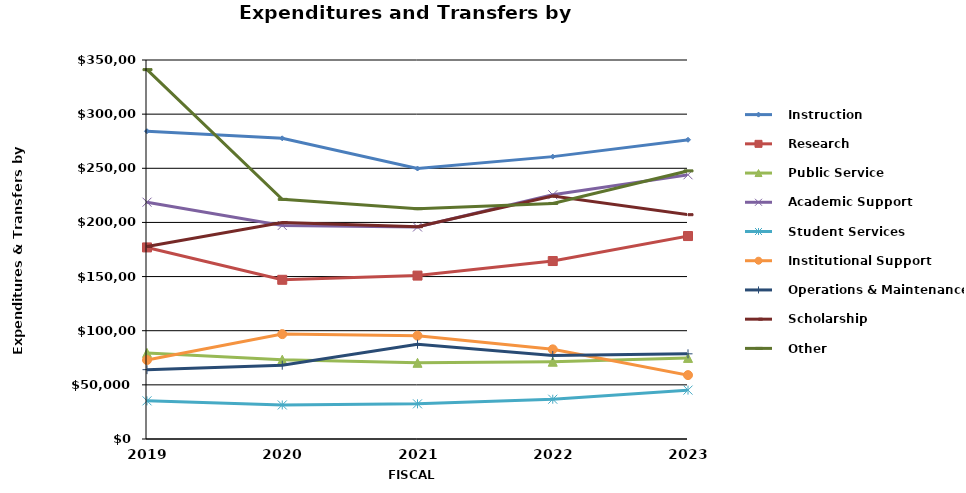
| Category |    Instruction |    Research |    Public Service |    Academic Support |    Student Services |    Institutional Support |    Operations & Maintenance |    Scholarship |    Other |
|---|---|---|---|---|---|---|---|---|---|
| 2019.0 | 284225 | 176924 | 79518 | 218697 | 35240 | 72961 | 64031 | 177815 | 341098 |
| 2020.0 | 277672 | 147031 | 73248 | 197224 | 31438 | 96854 | 68164 | 199854 | 221299 |
| 2021.0 | 249774 | 150892 | 70362 | 195785 | 32456 | 95426 | 87511 | 196059 | 212718 |
| 2022.0 | 260761 | 164348 | 71358 | 225552 | 36743 | 82794 | 77137 | 224362 | 217523 |
| 2023.0 | 276328 | 187420 | 74914 | 243996 | 45157 | 59007 | 78660 | 207140 | 247597 |